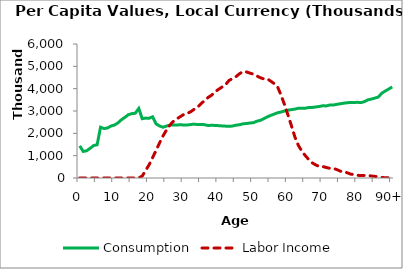
| Category | Consumption | Labor Income |
|---|---|---|
| 0 | 1439224.481 | 0 |
|  | 1190926.762 | 0 |
| 2 | 1218833.357 | 0 |
| 3 | 1330481.083 | 0 |
| 4 | 1454131.595 | 0 |
| 5 | 1486862.992 | 0 |
| 6 | 2273436.155 | 0 |
| 7 | 2214172.038 | 0 |
| 8 | 2240574.456 | 0 |
| 9 | 2326382.807 | 0 |
| 10 | 2373420.666 | 0 |
| 11 | 2467077.693 | 0 |
| 12 | 2607956.736 | 0 |
| 13 | 2715443.85 | 0 |
| 14 | 2834164.531 | 0 |
| 15 | 2882397.695 | 0 |
| 16 | 2901217.791 | 726.296 |
| 17 | 3113740.192 | 4564.09 |
| 18 | 2653738.818 | 88609.155 |
| 19 | 2681836.047 | 341776.241 |
| 20 | 2677044.774 | 599255.272 |
| 21 | 2740311.537 | 916482.598 |
| 22 | 2421219.486 | 1241933.324 |
| 23 | 2329798.741 | 1576060.158 |
| 24 | 2272668.902 | 1889738.501 |
| 25 | 2328503.487 | 2152287.534 |
| 26 | 2363784.22 | 2377304.107 |
| 27 | 2376637.253 | 2540174.69 |
| 28 | 2371237.607 | 2650154.019 |
| 29 | 2387281.485 | 2751578.789 |
| 30 | 2369060.404 | 2848904.637 |
| 31 | 2373108.728 | 2897131.398 |
| 32 | 2397156.062 | 2970943.526 |
| 33 | 2408472.894 | 3083046.169 |
| 34 | 2395249.34 | 3176946.046 |
| 35 | 2400533.968 | 3340931.045 |
| 36 | 2384941.271 | 3466391.342 |
| 37 | 2346873.093 | 3611461.552 |
| 38 | 2360892.856 | 3710510.995 |
| 39 | 2353227.602 | 3866224.846 |
| 40 | 2343156.512 | 3971186.782 |
| 41 | 2331391.873 | 4076742.297 |
| 42 | 2322942.592 | 4179810.85 |
| 43 | 2312516.81 | 4369318.18 |
| 44 | 2327204.872 | 4449268.443 |
| 45 | 2365359.022 | 4539181.689 |
| 46 | 2384112.339 | 4667246.002 |
| 47 | 2425493.043 | 4766157.55 |
| 48 | 2439957.726 | 4751131.294 |
| 49 | 2461558.709 | 4697010.036 |
| 50 | 2477230.956 | 4650022.462 |
| 51 | 2542308.515 | 4569318.475 |
| 52 | 2580903.858 | 4492035.003 |
| 53 | 2655224.539 | 4436802.103 |
| 54 | 2737107.43 | 4438313.162 |
| 55 | 2803620.725 | 4336801.479 |
| 56 | 2862059.94 | 4225124.534 |
| 57 | 2921547.763 | 4072735.831 |
| 58 | 2956274.625 | 3698773.298 |
| 59 | 3001410.872 | 3273114.334 |
| 60 | 3039121.788 | 2807951.389 |
| 61 | 3061529.276 | 2321812.822 |
| 62 | 3086172.115 | 1818611.744 |
| 63 | 3124916.721 | 1447902.563 |
| 64 | 3128547.32 | 1189688.301 |
| 65 | 3127559.103 | 995400.537 |
| 66 | 3156770.496 | 816235.743 |
| 67 | 3160512.296 | 673315.437 |
| 68 | 3182693.075 | 582586.717 |
| 69 | 3202054.075 | 512943.404 |
| 70 | 3235692.432 | 514669.534 |
| 71 | 3226808.039 | 468721.656 |
| 72 | 3268960.771 | 434860.646 |
| 73 | 3268625.138 | 428171.398 |
| 74 | 3296962.592 | 380779.197 |
| 75 | 3322050.941 | 306917.956 |
| 76 | 3348640.315 | 280601.703 |
| 77 | 3368772.381 | 236207.477 |
| 78 | 3383221.255 | 174703.767 |
| 79 | 3382357.459 | 152313.762 |
| 80 | 3388346.192 | 122790.747 |
| 81 | 3377192.717 | 105934.001 |
| 82 | 3421295.08 | 113004.212 |
| 83 | 3500235.71 | 112466.398 |
| 84 | 3533794.375 | 88784.425 |
| 85 | 3578321.894 | 72430.132 |
| 86 | 3626808.977 | 50104.485 |
| 87 | 3801802.099 | 24362.186 |
| 88 | 3893257.142 | 11558.917 |
| 89 | 3985238.998 | 12009.001 |
| 90+ | 4077220.854 | 12459.085 |